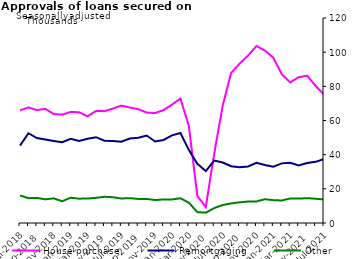
| Category | House purchase | Remortgaging | Other |
|---|---|---|---|
| Mar-2018 | 63518 | 46837 | 14073 |
| Apr-2018 | 63944 | 47703 | 13504 |
| May-2018 | 65680 | 53362 | 13818 |
| Jun-2018 | 66374 | 49287 | 14813 |
| Jul-2018 | 65767 | 45649 | 16009 |
| Aug-2018 | 66946 | 53662 | 14495 |
| Sep-2018 | 65733 | 49648 | 14625 |
| Oct-2018 | 66424 | 48389 | 13846 |
| Nov-2018 | 63548 | 47858 | 14407 |
| Dec-2018 | 63206 | 47066 | 12764 |
| Jan-2019 | 64897 | 48733 | 14782 |
| Feb-2019 | 64959 | 48101 | 14324 |
| Mar-2019 | 62663 | 49189 | 14409 |
| Apr-2019 | 66665 | 49936 | 14725 |
| May-2019 | 66355 | 48112 | 15410 |
| Jun-2019 | 67317 | 48033 | 15159 |
| Jul-2019 | 68338 | 48384 | 14215 |
| Aug-2019 | 66630 | 50274 | 14462 |
| Sep-2019 | 66046 | 50069 | 14039 |
| Oct-2019 | 64142 | 50960 | 14073 |
| Nov-2019 | 64067 | 47295 | 13430 |
| Dec-2019 | 65790 | 48524 | 13803 |
| Jan-2020 | 69193 | 50897 | 13763 |
| Feb-2020 | 73035 | 52315 | 14583 |
| Mar-2020 | 56945 | 42279 | 11952 |
| Apr-2020 | 16204 | 34140 | 6333 |
| May-2020 | 9486 | 30413 | 6099 |
| Jun-2020 | 40870 | 36779 | 8773 |
| Jul-2020 | 68024 | 36337 | 10395 |
| Aug-2020 | 86232 | 33717 | 11392 |
| Sep-2020 | 92030 | 32897 | 12043 |
| Oct-2020 | 97018 | 33072 | 12529 |
| Nov-2020 | 103126 | 34935 | 12600 |
| Dec-2020 | 100546 | 33850 | 13959 |
| Jan-2021 | 96645 | 32776 | 13381 |
| Feb-2021 | 87385 | 34459 | 13307 |
| Mar-2021 | 82735 | 34767 | 14494 |